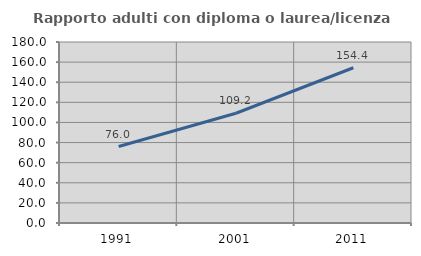
| Category | Rapporto adulti con diploma o laurea/licenza media  |
|---|---|
| 1991.0 | 76.04 |
| 2001.0 | 109.151 |
| 2011.0 | 154.369 |